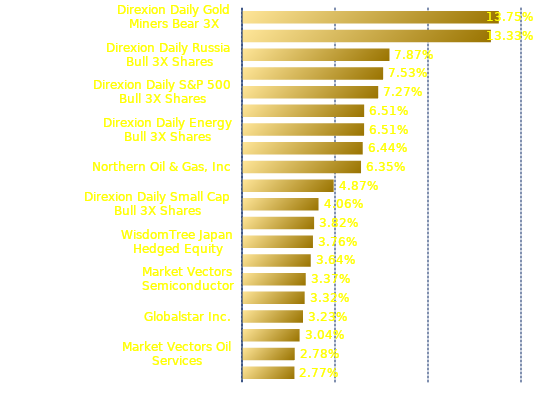
| Category | 13.75% |
|---|---|
| Direxion Daily Gold Miners Bear 3X | 0.138 |
| Direxion Jr Gold Miners Index Bear 3X | 0.133 |
| Direxion Daily Russia Bull 3X Shares | 0.079 |
| ProShares UltraPro S&P 500 | 0.075 |
| Direxion Daily S&P 500 Bull 3X Shares | 0.073 |
| Proshares Ultra QQQ | 0.065 |
| Direxion Daily Energy Bull 3X Shares | 0.065 |
| Direxion Daily Financial Bull 3X Shares | 0.064 |
| Northern Oil & Gas, Inc | 0.063 |
| ProShares Ultra S&P500 | 0.049 |
| Direxion Daily Small Cap Bull 3X Shares | 0.041 |
| ProShares UltraShort 20+ Year Treasury | 0.038 |
| WisdomTree Japan Hedged Equity | 0.038 |
| PowerShares Exchange-Traded Fund Trust II | 0.036 |
| Market Vectors Semiconductor | 0.034 |
| Technology Sector SPDR Fund | 0.033 |
| Globalstar Inc. | 0.032 |
| iShares MSCI Malaysia | 0.03 |
| Market Vectors Oil Services | 0.028 |
| iShares MSCI Japan | 0.028 |